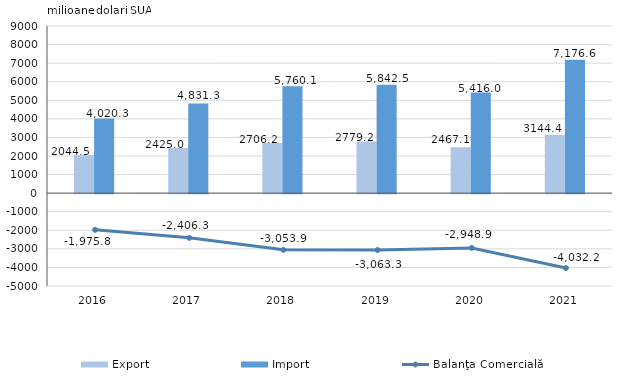
| Category | Export | Import |
|---|---|---|
| 2016.0 | 2044.5 | 4020.3 |
| 2017.0 | 2425 | 4831.3 |
| 2018.0 | 2706.2 | 5760.1 |
| 2019.0 | 2779.2 | 5842.5 |
| 2020.0 | 2467.1 | 5416 |
| 2021.0 | 3144.4 | 7176.6 |